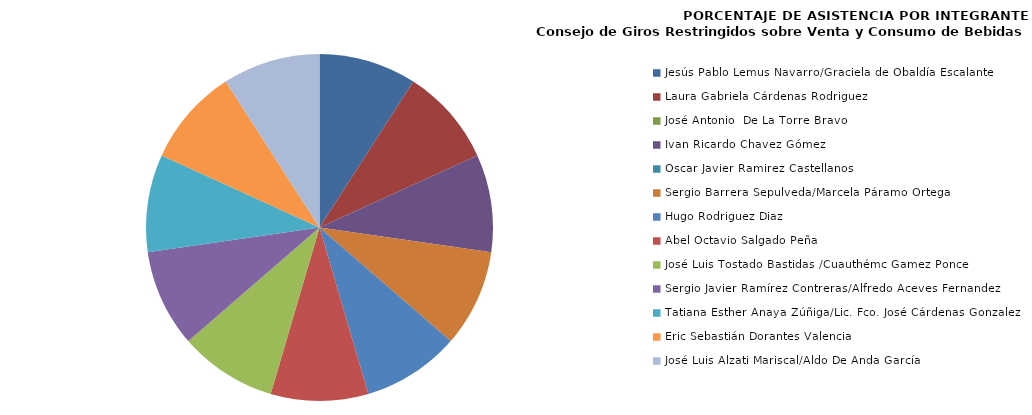
| Category | Series 0 |
|---|---|
| Jesús Pablo Lemus Navarro/Graciela de Obaldía Escalante | 100 |
| Laura Gabriela Cárdenas Rodriguez | 100 |
| José Antonio  De La Torre Bravo | 0 |
| Ivan Ricardo Chavez Gómez | 100 |
| Oscar Javier Ramirez Castellanos | 0 |
| Sergio Barrera Sepulveda/Marcela Páramo Ortega | 100 |
| Hugo Rodriguez Diaz | 100 |
| Abel Octavio Salgado Peña | 100 |
| José Luis Tostado Bastidas /Cuauthémc Gamez Ponce | 100 |
| Sergio Javier Ramírez Contreras/Alfredo Aceves Fernandez | 100 |
| Tatiana Esther Anaya Zúñiga/Lic. Fco. José Cárdenas Gonzalez | 100 |
| Eric Sebastián Dorantes Valencia | 100 |
| José Luis Alzati Mariscal/Aldo De Anda García | 100 |